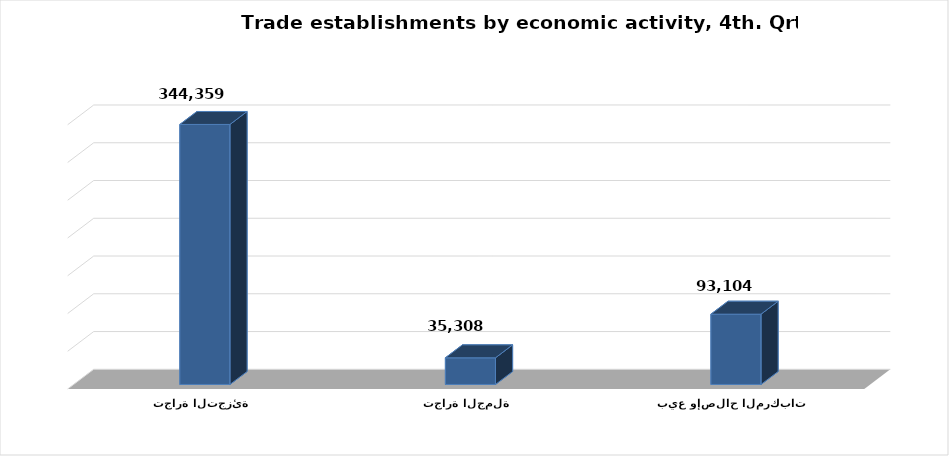
| Category | عدد المنشآت |
|---|---|
| بيع وإصلاح المركبات  | 93104 |
| تجارة الجملة | 35308 |
| تجارة التجزئة | 344359 |